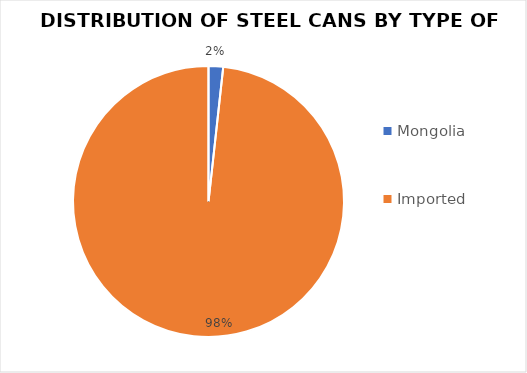
| Category | Series 1 |
|---|---|
| Mongolia | 7 |
| Imported | 396 |